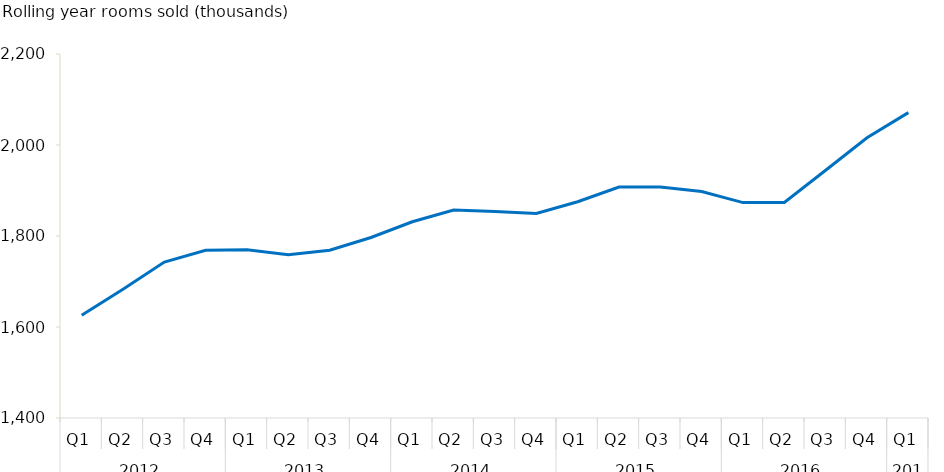
| Category | Series 0 |
|---|---|
| 0 | 1625.798 |
| 1 | 1682.986 |
| 2 | 1742.795 |
| 3 | 1768.685 |
| 4 | 1769.588 |
| 5 | 1758.95 |
| 6 | 1768.673 |
| 7 | 1796.703 |
| 8 | 1831.335 |
| 9 | 1857.225 |
| 10 | 1854.028 |
| 11 | 1849.521 |
| 12 | 1875.196 |
| 13 | 1907.646 |
| 14 | 1907.929 |
| 15 | 1897.876 |
| 16 | 1873.411 |
| 17 | 1873.677 |
| 18 | 1944.378 |
| 19 | 2016.024 |
| 20 | 2071.105 |